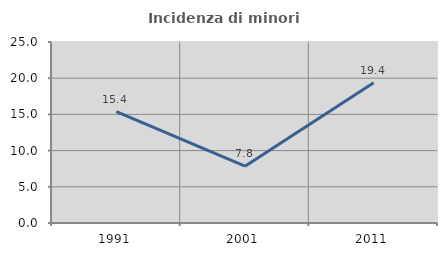
| Category | Incidenza di minori stranieri |
|---|---|
| 1991.0 | 15.385 |
| 2001.0 | 7.843 |
| 2011.0 | 19.372 |